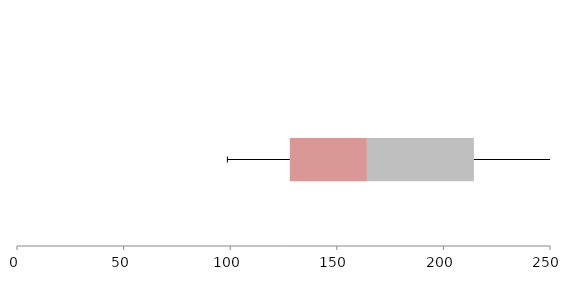
| Category | Series 1 | Series 2 | Series 3 |
|---|---|---|---|
| 0 | 127.956 | 36.168 | 50.17 |